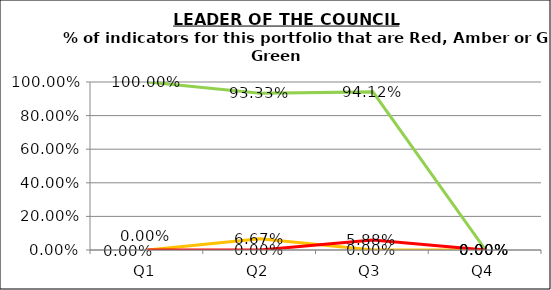
| Category | Green | Amber | Red |
|---|---|---|---|
| Q1 | 1 | 0 | 0 |
| Q2 | 0.933 | 0.067 | 0 |
| Q3 | 0.941 | 0 | 0.059 |
| Q4 | 0 | 0 | 0 |